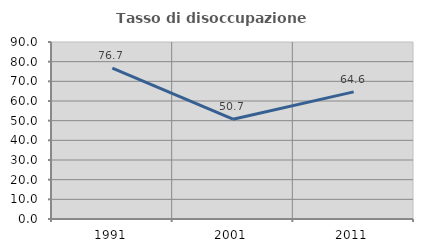
| Category | Tasso di disoccupazione giovanile  |
|---|---|
| 1991.0 | 76.677 |
| 2001.0 | 50.746 |
| 2011.0 | 64.646 |